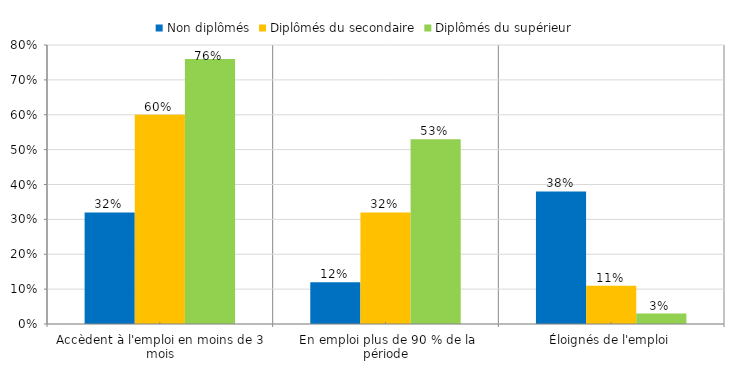
| Category | Non diplômés | Diplômés du secondaire | Diplômés du supérieur |
|---|---|---|---|
| Accèdent à l'emploi en moins de 3 mois | 0.32 | 0.6 | 0.76 |
| En emploi plus de 90 % de la période | 0.12 | 0.32 | 0.53 |
| Éloignés de l'emploi | 0.38 | 0.11 | 0.03 |